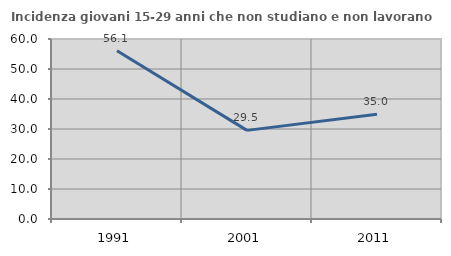
| Category | Incidenza giovani 15-29 anni che non studiano e non lavorano  |
|---|---|
| 1991.0 | 56.077 |
| 2001.0 | 29.545 |
| 2011.0 | 34.951 |